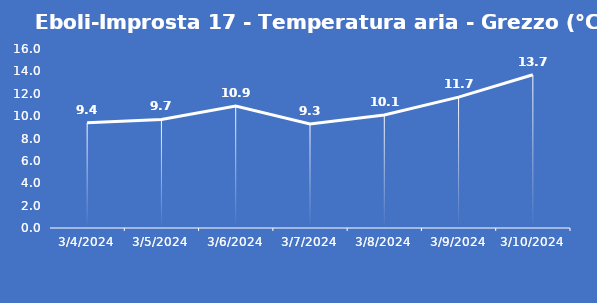
| Category | Eboli-Improsta 17 - Temperatura aria - Grezzo (°C) |
|---|---|
| 3/4/24 | 9.4 |
| 3/5/24 | 9.7 |
| 3/6/24 | 10.9 |
| 3/7/24 | 9.3 |
| 3/8/24 | 10.1 |
| 3/9/24 | 11.7 |
| 3/10/24 | 13.7 |